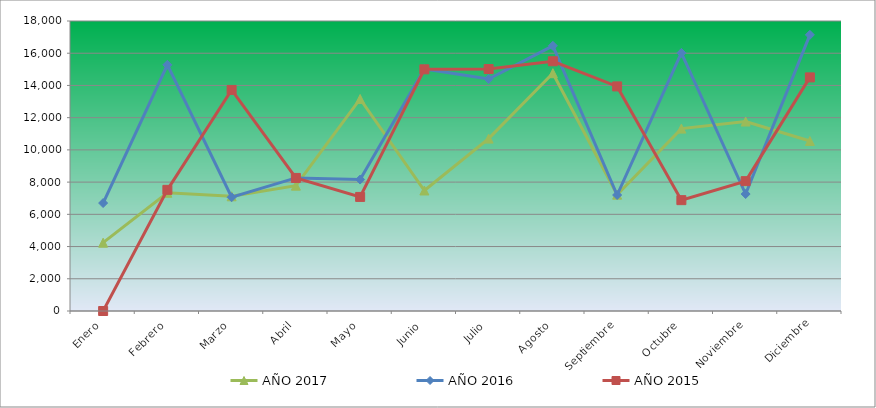
| Category | AÑO 2017 | AÑO 2016 | AÑO 2015 |
|---|---|---|---|
| Enero | 4240 | 6700 | 0 |
| Febrero | 7340 | 15280 | 7520 |
| Marzo | 7120 | 7060 | 13720 |
| Abril | 7780 | 8260 | 8260 |
| Mayo | 13160 | 8160 | 7080 |
| Junio | 7480 | 15020 | 15000 |
| Julio | 10700 | 14400 | 15020 |
| Agosto | 14760 | 16460 | 15500 |
| Septiembre | 7220 | 7200 | 13940 |
| Octubre | 11320 | 16020 | 6880 |
| Noviembre | 11760 | 7260 | 8060 |
| Diciembre | 10550 | 17140 | 14500 |